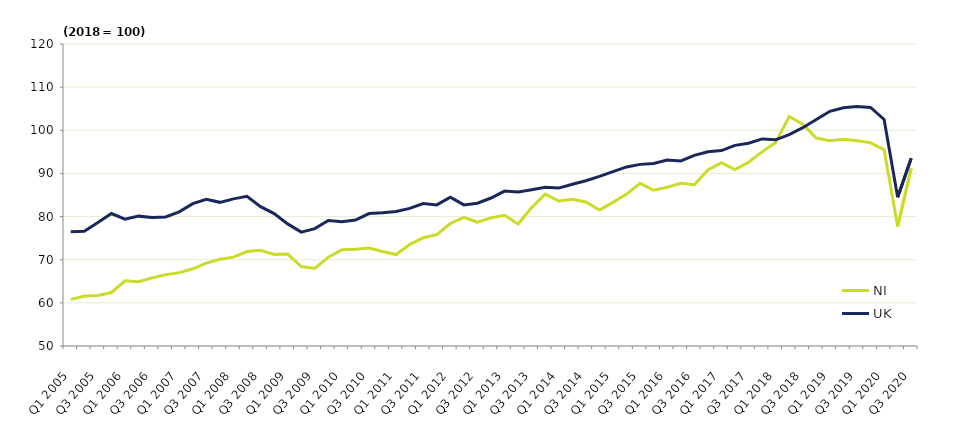
| Category | NI | UK |
|---|---|---|
| Q1 2005 | 60.8 | 76.5 |
|  | 61.6 | 76.6 |
| Q3 2005 | 61.7 | 78.6 |
|  | 62.4 | 80.7 |
| Q1 2006 | 65.1 | 79.4 |
|  | 64.9 | 80.1 |
| Q3 2006 | 65.8 | 79.8 |
|  | 66.5 | 79.9 |
| Q1 2007 | 67 | 81.1 |
|  | 67.9 | 83 |
| Q3 2007 | 69.2 | 84 |
|  | 70.1 | 83.3 |
| Q1 2008 | 70.6 | 84.1 |
|  | 71.9 | 84.7 |
| Q3 2008 | 72.2 | 82.3 |
|  | 71.2 | 80.7 |
| Q1 2009 | 71.3 | 78.3 |
|  | 68.4 | 76.4 |
| Q3 2009 | 68 | 77.2 |
|  | 70.6 | 79.1 |
| Q1 2010 | 72.3 | 78.8 |
|  | 72.4 | 79.2 |
| Q3 2010 | 72.7 | 80.7 |
|  | 71.9 | 80.9 |
| Q1 2011 | 71.2 | 81.2 |
|  | 73.5 | 81.9 |
| Q3 2011 | 75.1 | 83 |
|  | 75.8 | 82.7 |
| Q1 2012 | 78.4 | 84.5 |
|  | 79.8 | 82.7 |
| Q3 2012 | 78.7 | 83.1 |
|  | 79.7 | 84.3 |
| Q1 2013 | 80.3 | 85.9 |
|  | 78.3 | 85.7 |
| Q3 2013 | 82.1 | 86.2 |
|  | 85.2 | 86.8 |
| Q1 2014 | 83.6 | 86.6 |
|  | 84 | 87.5 |
| Q3 2014 | 83.4 | 88.3 |
|  | 81.5 | 89.3 |
| Q1 2015 | 83.3 | 90.4 |
|  | 85.2 | 91.5 |
| Q3 2015 | 87.7 | 92.1 |
|  | 86.1 | 92.3 |
| Q1 2016 | 86.8 | 93.1 |
|  | 87.7 | 92.9 |
| Q3 2016 | 87.4 | 94.2 |
|  | 90.8 | 95 |
| Q1 2017 | 92.5 | 95.3 |
|  | 90.9 | 96.5 |
| Q3 2017 | 92.6 | 97 |
|  | 95 | 98 |
| Q1 2018 | 97.2 | 97.8 |
|  | 103.2 | 99 |
| Q3 2018 | 101.4 | 100.6 |
|  | 98.2 | 102.5 |
| Q1 2019 | 97.6 | 104.4 |
|  | 97.9 | 105.2 |
| Q3 2019 | 97.6 | 105.5 |
|  | 97.1 | 105.3 |
| Q1 2020 | 95.5 | 102.5 |
|  | 77.7 | 84.5 |
| Q3 2020 | 91.2 | 93.5 |